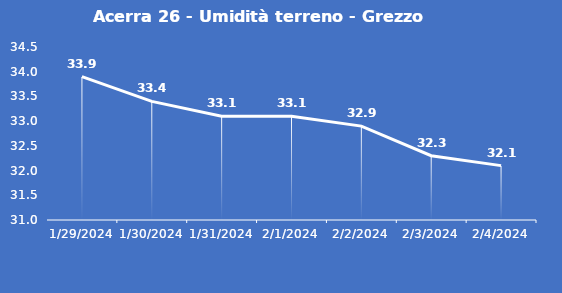
| Category | Acerra 26 - Umidità terreno - Grezzo (%VWC) |
|---|---|
| 1/29/24 | 33.9 |
| 1/30/24 | 33.4 |
| 1/31/24 | 33.1 |
| 2/1/24 | 33.1 |
| 2/2/24 | 32.9 |
| 2/3/24 | 32.3 |
| 2/4/24 | 32.1 |